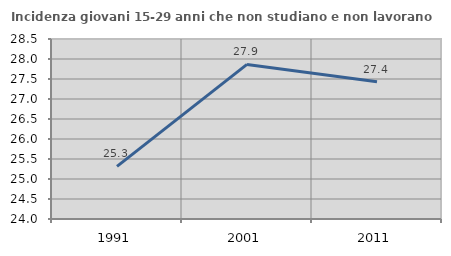
| Category | Incidenza giovani 15-29 anni che non studiano e non lavorano  |
|---|---|
| 1991.0 | 25.316 |
| 2001.0 | 27.865 |
| 2011.0 | 27.429 |